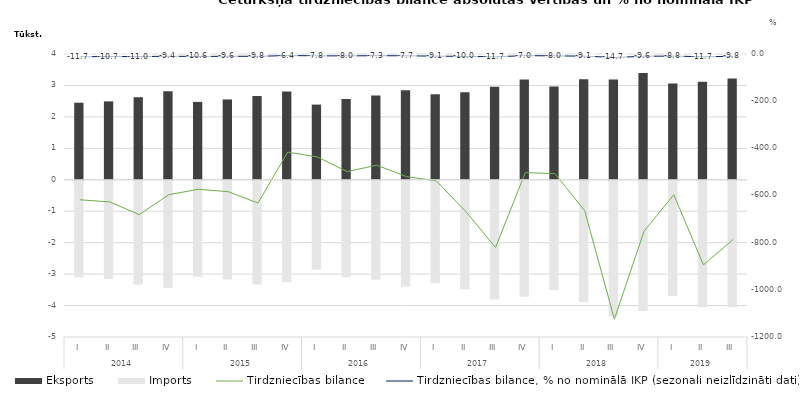
| Category | Eksports | Imports |
|---|---|---|
| 0 | 2450.7 | -3068.8 |
| 1 | 2493.4 | -3120.5 |
| 2 | 2625.5 | -3306.5 |
| 3 | 2816.7 | -3413.2 |
| 4 | 2476.5 | -3050.1 |
| 5 | 2555.2 | -3139.2 |
| 6 | 2663.4 | -3295.5 |
| 7 | 2809.5 | -3225.4 |
| 8 | 2391.5 | -2828.1 |
| 9 | 2569.5 | -3068 |
| 10 | 2678.2 | -3149.9 |
| 11 | 2850.8 | -3370.5 |
| 12 | 2719.6 | -3257.4 |
| 13 | 2783.8 | -3452 |
| 14 | 2956.9 | -3777.4 |
| 15 | 3187 | -3690 |
| 16 | 2969.9 | -3477.4 |
| 17 | 3193.3 | -3857.4 |
| 18 | 3189.7 | -4313.9 |
| 19 | 3392.8 | -4144.2 |
| 20 | 3064.4 | -3661.1 |
| 21 | 3120.7 | -4015.1 |
| 22 | 3224.4 | -4011 |